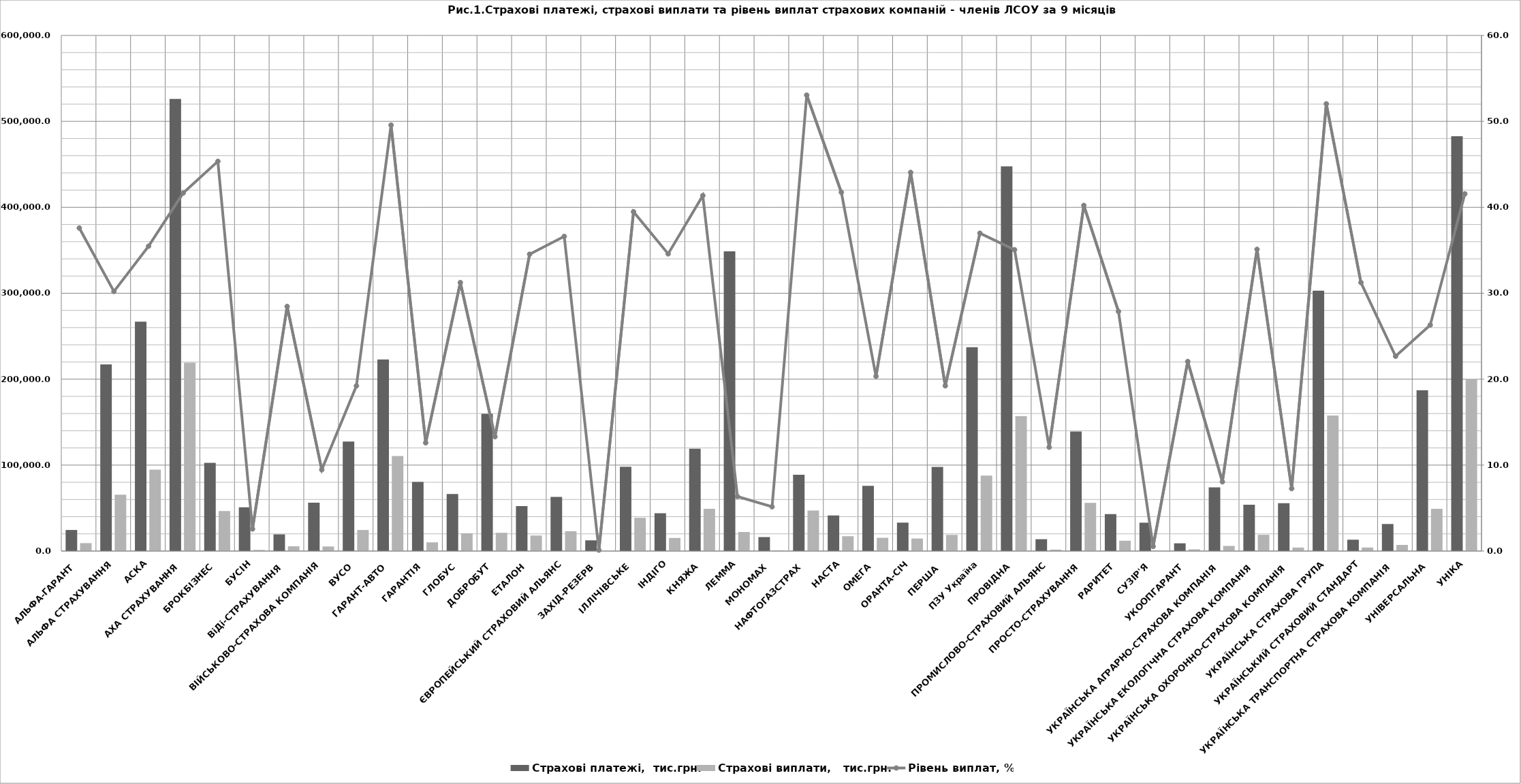
| Category | Страхові платежі,  тис.грн. | Страхові виплати,   тис.грн. |
|---|---|---|
| АЛЬФА-ГАРАНТ | 24517 | 9215.8 |
| АЛЬФА СТРАХУВАННЯ | 217087.7 | 65580.2 |
| АСКА | 266994 | 94719.6 |
| АХА СТРАХУВАННЯ | 526069 | 219163 |
| БРОКБІЗНЕС | 102616.6 | 46531.8 |
| БУСІН | 50915.4 | 1308.4 |
| ВіДі-СТРАХУВАННЯ | 19409 | 5524 |
| ВІЙСЬКОВО-СТРАХОВА КОМПАНІЯ | 56208.3 | 5320.4 |
| ВУСО | 127426.8 | 24490.8 |
| ГАРАНТ-АВТО | 222870.9 | 110470.6 |
| ГАРАНТІЯ | 80384.9 | 10124.6 |
| ГЛОБУС | 66342 | 20727.8 |
| ДОБРОБУТ | 159729.1 | 21252.3 |
| ЕТАЛОН | 52322.4 | 18070.9 |
| ЄВРОПЕЙСЬКИЙ СТРАХОВИЙ АЛЬЯНС | 63025 | 23076.2 |
| ЗАХІД-РЕЗЕРВ | 12474.1 | 13.8 |
| ІЛЛІЧІВСЬКЕ | 98028.4 | 38704.3 |
| ІНДІГО | 43982.1 | 15211.1 |
| КНЯЖА | 119006 | 49222.7 |
| ЛЕММА | 348800.3 | 22159.2 |
| МОНОМАХ | 16253.1 | 837.3 |
| НАФТОГАЗСТРАХ | 88739.8 | 47077.5 |
| НАСТА | 41322.6 | 17249.9 |
| ОМЕГА | 75879.8 | 15425 |
| ОРАНТА-СІЧ | 33080.8 | 14574.2 |
| ПЕРША  | 97889 | 18824 |
| ПЗУ Україна | 237174.8 | 87716.5 |
| ПРОВІДНА | 447700.9 | 156973.3 |
| ПРОМИСЛОВО-СТРАХОВИЙ АЛЬЯНС | 13784.9 | 1665.9 |
| ПРОСТО-СТРАХУВАННЯ | 139199.9 | 55986.4 |
| РАРИТЕТ | 43066.6 | 12006.9 |
| СУЗІР'Я | 33006.1 | 175.2 |
| УКООПГАРАНТ | 9016.9 | 1988.9 |
| УКРАЇНСЬКА АГРАРНО-СТРАХОВА КОМПАНІЯ | 74049.1 | 5968.2 |
| УКРАЇНСЬКА ЕКОЛОГІЧНА СТРАХОВА КОМПАНІЯ | 53861.1 | 18909.5 |
| УКРАЇНСЬКА ОХОРОННО-СТРАХОВА КОМПАНІЯ | 55688.7 | 4047.2 |
| УКРАЇНСЬКА СТРАХОВА ГРУПА | 303042.8 | 157694.6 |
| УКРАЇНСЬКИЙ СТРАХОВИЙ СТАНДАРТ | 13218.8 | 4130.3 |
| УКРАЇНСЬКА ТРАНСПОРТНА СТРАХОВА КОМПАНІЯ | 31469.8 | 7133 |
| УНІВЕРСАЛЬНА | 187070.9 | 49204.1 |
| УНІКА | 482600 | 200590.4 |